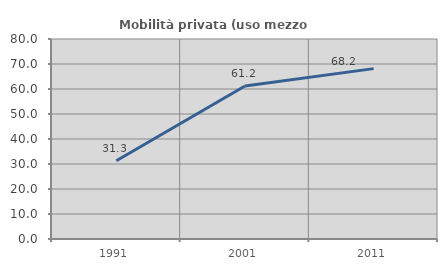
| Category | Mobilità privata (uso mezzo privato) |
|---|---|
| 1991.0 | 31.291 |
| 2001.0 | 61.216 |
| 2011.0 | 68.152 |